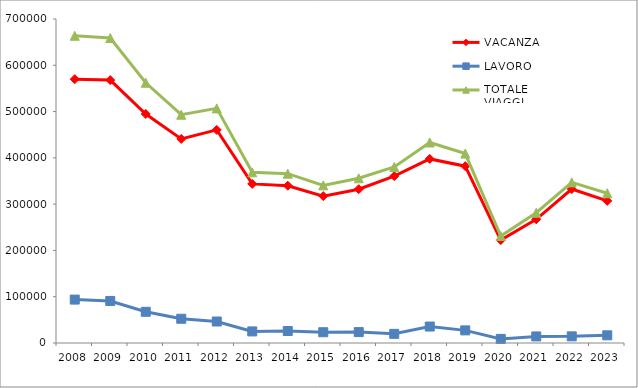
| Category | VACANZA | LAVORO | TOTALE VIAGGI |
|---|---|---|---|
| 2008 | 569942 | 93804 | 663746 |
| 2009 | 568103 | 90861 | 658964 |
| 2010 | 494811 | 67399 | 562211 |
| 2011 | 440821 | 52379 | 493200 |
| 2012 | 460442 | 46426 | 506868 |
| 2013 | 343728 | 25028 | 368756 |
| 2014 | 339850 | 25932 | 365782 |
| 2015 | 317307 | 23250 | 340557 |
| 2016 | 332304 | 23545 | 355849 |
| 2017 | 360609 | 19802 | 380411 |
| 2018 | 397697 | 35549 | 433246 |
| 2019 | 382004 | 27269 | 409273 |
| 2020 | 222327 | 8871 | 231197 |
| 2021 | 267276 | 14195 | 281471 |
| 2022 | 332592 | 14374 | 346966 |
| 2023 | 307004 | 16602 | 323606 |